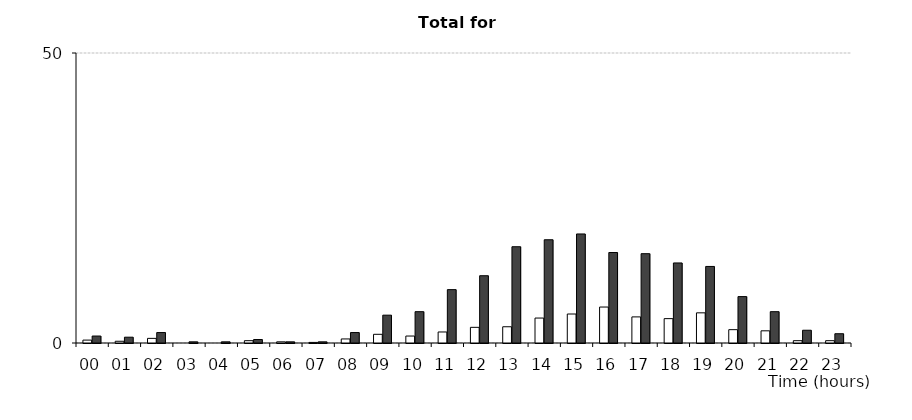
| Category | Killed and adjusted serious | All |
|---|---|---|
| 00 | 0.5 | 1.2 |
| 01 | 0.3 | 1 |
| 02 | 0.8 | 1.8 |
| 03 | 0 | 0.2 |
| 04 | 0 | 0.2 |
| 05 | 0.4 | 0.6 |
| 06 | 0.2 | 0.2 |
| 07 | 0.1 | 0.2 |
| 08 | 0.7 | 1.8 |
| 09 | 1.5 | 4.8 |
| 10 | 1.2 | 5.4 |
| 11 | 1.9 | 9.2 |
| 12 | 2.7 | 11.6 |
| 13 | 2.8 | 16.6 |
| 14 | 4.3 | 17.8 |
| 15 | 5 | 18.8 |
| 16 | 6.2 | 15.6 |
| 17 | 4.5 | 15.4 |
| 18 | 4.2 | 13.8 |
| 19 | 5.2 | 13.2 |
| 20 | 2.3 | 8 |
| 21 | 2.1 | 5.4 |
| 22 | 0.4 | 2.2 |
| 23 | 0.4 | 1.6 |